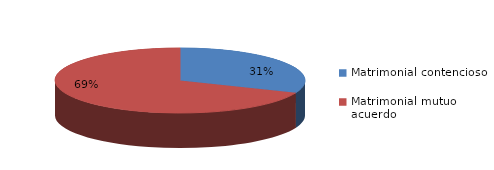
| Category | Series 0 |
|---|---|
| 0 | 285 |
| 1 | 628 |